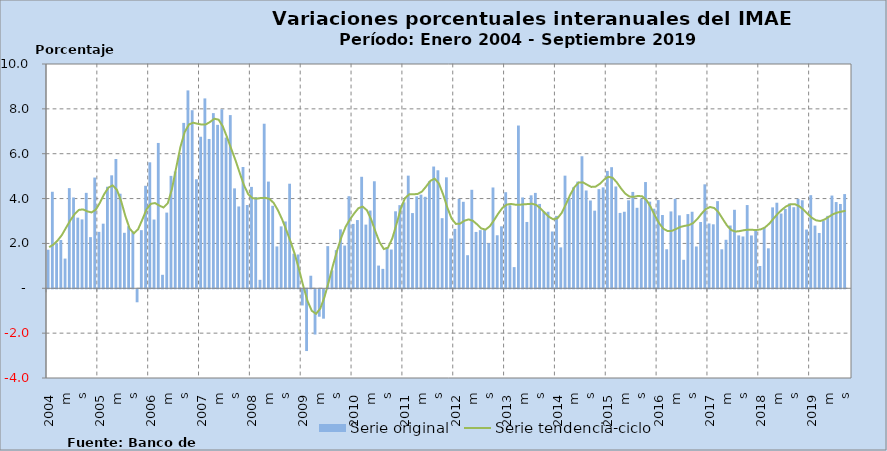
| Category | Serie original |
|---|---|
| 2004 | 1.72 |
| f | 4.303 |
| m | 2.014 |
| a | 2.154 |
| m | 1.325 |
| j | 4.466 |
| j | 4.049 |
| a | 3.149 |
| s | 3.071 |
| o | 4.255 |
| n | 2.281 |
| d | 4.937 |
| 2005 | 2.516 |
| f | 2.881 |
| m | 4.527 |
| a | 5.036 |
| m | 5.765 |
| j | 4.216 |
| j | 2.474 |
| a | 2.767 |
| s | 2.519 |
| o | -0.58 |
| n | 2.592 |
| d | 4.57 |
| 2006 | 5.617 |
| f | 3.065 |
| m | 6.48 |
| a | 0.602 |
| m | 3.375 |
| j | 5.012 |
| j | 5.209 |
| a | 5.949 |
| s | 7.374 |
| o | 8.822 |
| n | 7.939 |
| d | 4.861 |
| 2007 | 6.757 |
| f | 8.466 |
| m | 6.658 |
| a | 7.81 |
| m | 7.288 |
| j | 7.981 |
| j | 6.721 |
| a | 7.722 |
| s | 4.455 |
| o | 3.648 |
| n | 5.408 |
| d | 3.713 |
| 2008 | 4.52 |
| f | 4.065 |
| m | 0.377 |
| a | 7.337 |
| m | 4.758 |
| j | 3.678 |
| j | 1.866 |
| a | 2.76 |
| s | 2.979 |
| o | 4.662 |
| n | 1.541 |
| d | 1.508 |
| 2009 | -0.721 |
| f | -2.754 |
| m | 0.56 |
| a | -2.017 |
| m | -1.223 |
| j | -1.31 |
| j | 1.879 |
| a | 0.8 |
| s | 1.702 |
| o | 2.627 |
| n | 1.905 |
| d | 4.106 |
| 2010 | 2.87 |
| f | 3.042 |
| m | 4.971 |
| a | 2.839 |
| m | 3.466 |
| j | 4.771 |
| j | 1.013 |
| a | 0.866 |
| s | 1.8 |
| o | 1.728 |
| n | 3.433 |
| d | 3.707 |
| 2011 | 3.83 |
| f | 5.022 |
| m | 3.353 |
| a | 4.099 |
| m | 4.174 |
| j | 4.08 |
| j | 4.773 |
| a | 5.429 |
| s | 5.261 |
| o | 3.126 |
| n | 4.947 |
| d | 2.219 |
| 2012 | 2.648 |
| f | 3.987 |
| m | 3.856 |
| a | 1.475 |
| m | 4.391 |
| j | 2.512 |
| j | 2.592 |
| a | 2.633 |
| s | 2.01 |
| o | 4.495 |
| n | 2.364 |
| d | 2.762 |
| 2013 | 4.283 |
| f | 3.703 |
| m | 0.944 |
| a | 7.257 |
| m | 4.05 |
| j | 2.957 |
| j | 4.145 |
| a | 4.253 |
| s | 3.761 |
| o | 3.427 |
| n | 3.413 |
| d | 2.532 |
| 2014 | 3.228 |
| f | 1.825 |
| m | 5.022 |
| a | 4.011 |
| m | 4.503 |
| j | 4.758 |
| j | 5.888 |
| a | 4.36 |
| s | 3.914 |
| o | 3.461 |
| n | 4.42 |
| d | 4.499 |
| 2015 | 5.234 |
| f | 5.399 |
| m | 4.539 |
| a | 3.361 |
| m | 3.413 |
| j | 3.923 |
| j | 4.296 |
| a | 3.589 |
| s | 3.984 |
| o | 4.737 |
| n | 3.863 |
| d | 3.548 |
| 2016 | 3.933 |
| f | 3.267 |
| m | 1.74 |
| a | 3.427 |
| m | 3.989 |
| j | 3.252 |
| j | 1.27 |
| a | 3.308 |
| s | 3.412 |
| o | 1.864 |
| n | 2.954 |
| d | 4.636 |
| 2017 | 2.891 |
| f | 2.852 |
| m | 3.886 |
| a | 1.738 |
| m | 2.162 |
| j | 2.799 |
| j | 3.5 |
| a | 2.358 |
| s | 2.31 |
| o | 3.711 |
| n | 2.356 |
| d | 2.602 |
| 2018 | 0.993 |
| f | 2.687 |
| m | 1.782 |
| a | 3.608 |
| m | 3.815 |
| j | 3.333 |
| j | 3.537 |
| a | 3.783 |
| s | 3.616 |
| o | 3.987 |
| n | 3.926 |
| d | 2.619 |
| 2019 | 4.152 |
| f | 2.794 |
| m | 2.467 |
| a | 3.008 |
| m | 3.228 |
| j | 4.134 |
| j | 3.845 |
| a | 3.76 |
| s | 4.2 |